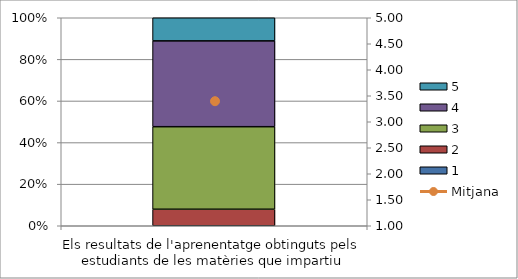
| Category | 1 | 2 | 3 | 4 | 5 |
|---|---|---|---|---|---|
| Els resultats de l'aprenentatge obtinguts pels estudiants de les matèries que impartiu | 0 | 5 | 25 | 26 | 7 |